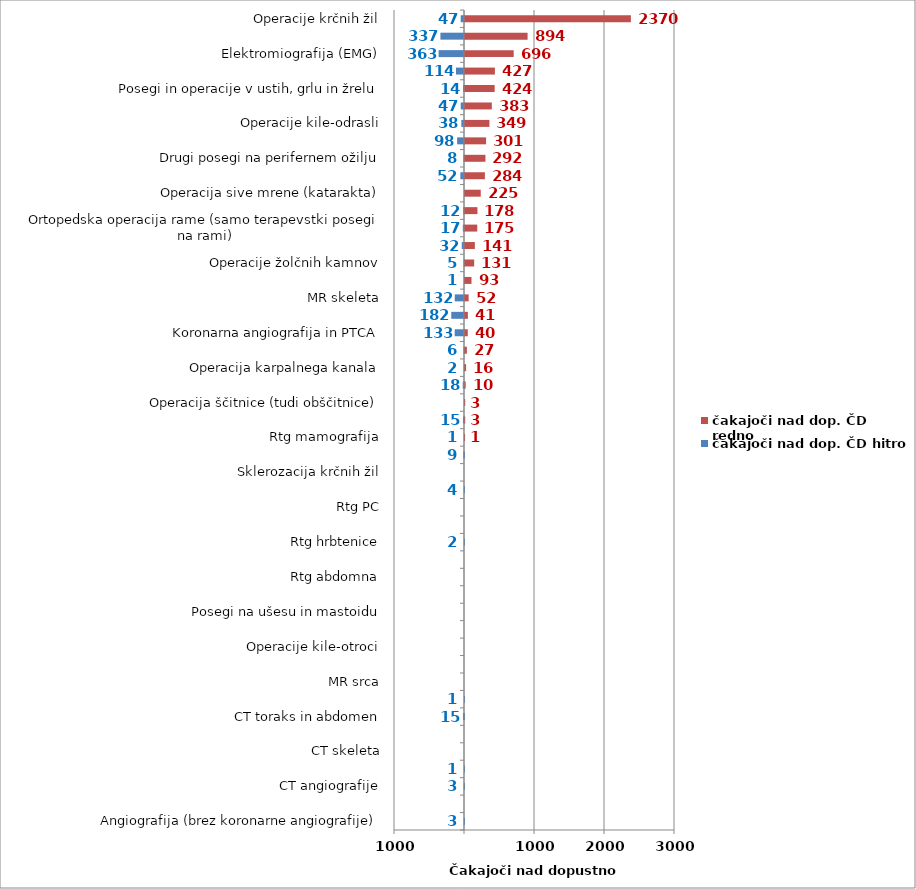
| Category | čakajoči nad dop. ČD hitro | čakajoči nad dop. ČD redno |
|---|---|---|
| Angiografija (brez koronarne angiografije) | -3 | 0 |
| Artroplastika gležnja | 0 | 0 |
| CT angiografije | -3 | 0 |
| CT glave in vratu | -1 | 0 |
| CT skeleta | 0 | 0 |
| CT srca | 0 | 0 |
| CT toraks in abdomen | -15 | 0 |
| Elektroencefalografija (EEG) | -1 | 0 |
| MR srca | 0 | 0 |
| MR toraks in abdomen | 0 | 0 |
| Operacije kile-otroci | 0 | 0 |
| Posegi na arterijah (brez PTA) | 0 | 0 |
| Posegi na ušesu in mastoidu | 0 | 0 |
| PTA (perkutana transluminalna angioplastika) | 0 | 0 |
| Rtg abdomna | 0 | 0 |
| Rtg glave | 0 | 0 |
| Rtg hrbtenice | -2 | 0 |
| Rtg ledvic in sečnega mehurja | 0 | 0 |
| Rtg PC | 0 | 0 |
| Rtg skletela | -4 | 0 |
| Sklerozacija krčnih žil | 0 | 0 |
| ultrazvok mehkih tkiv (mišica, tetiva, sklep, skrotum, vrat, kolki novorojenčki) | -9 | 0 |
| Rtg mamografija | -1 | 1 |
| MR angiografije | -15 | 3 |
| Operacija ščitnice (tudi obščitnice) | 0 | 3 |
| ultrazvok rame | -18 | 10 |
| Operacija karpalnega kanala | -2 | 16 |
| Operacije na odprtem srcu | -6 | 27 |
| Koronarna angiografija in PTCA | -133 | 40 |
| MR glave in vratu | -182 | 41 |
| MR skeleta | -132 | 52 |
| Posegi in operacije nosu in obnosnih votlin | -1 | 93 |
| Operacije žolčnih kamnov | -5 | 131 |
| Terapevtske artroskopije (kolenske križne vezi, kolena) | -32 | 141 |
| Ortopedska operacija rame (samo terapevstki posegi na rami) | -17 | 175 |
| ultrazvok dojke | -12 | 178 |
| Operacija sive mrene (katarakta) | 0 | 225 |
| Posegi in operacije hrbtenice | -52 | 284 |
| Drugi posegi na perifernem ožilju | -8 | 292 |
| Artroplastika kolka (protetika, endoproteza) | -98 | 301 |
| Operacije kile-odrasli | -38 | 349 |
| Artroplastika kolena | -47 | 383 |
| Posegi in operacije v ustih, grlu in žrelu | -14 | 424 |
| ultrazvok vratnih žil | -114 | 427 |
| Elektromiografija (EMG) | -363 | 696 |
| ultrazvok srca | -337 | 894 |
| Operacije krčnih žil | -47 | 2370 |